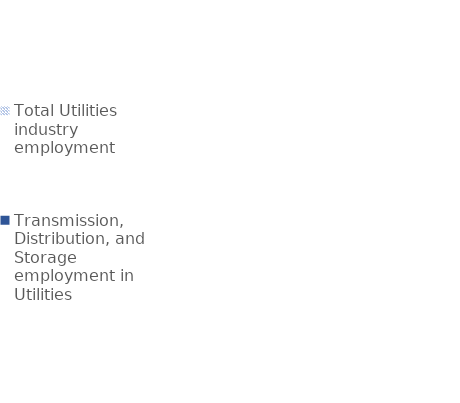
| Category | Total Utilities industry employment | Transmission, Distribution, and Storage employment in Utilities |
|---|---|---|
| Utilities | 807262 | 408016 |